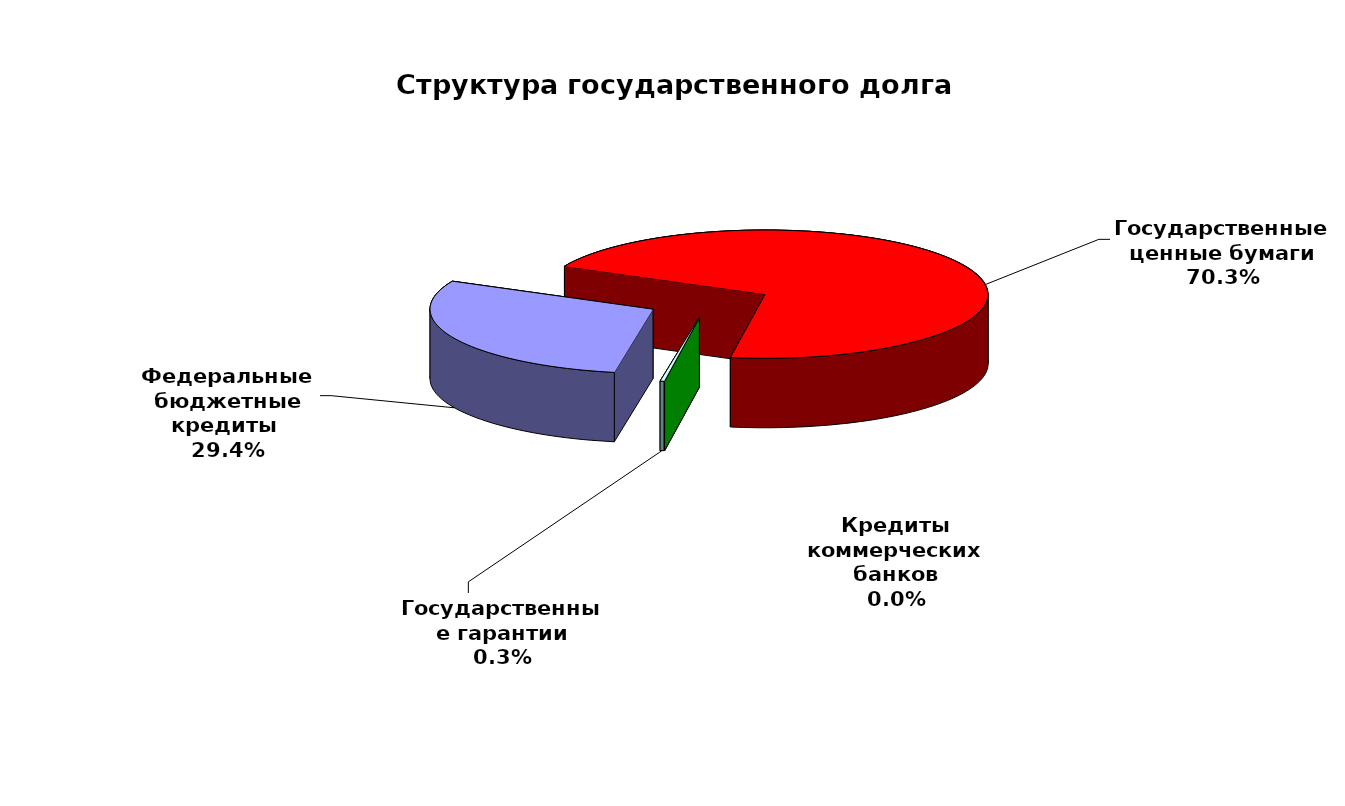
| Category | Series 0 |
|---|---|
| Федеральные бюджетные кредиты  | 18954967.463 |
| Государственные ценные бумаги | 45300000 |
| Кредиты коммерческих банков | 0 |
| Государственные гарантии | 184738.15 |